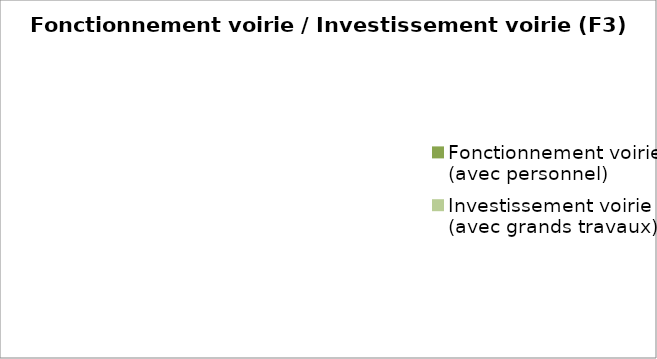
| Category | Series 0 |
|---|---|
| Fonctionnement voirie (avec personnel) | 0 |
| Investissement voirie (avec grands travaux) | 0 |